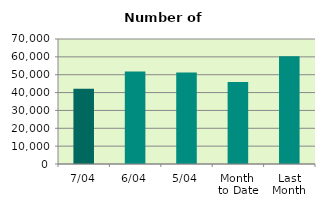
| Category | Series 0 |
|---|---|
| 7/04 | 42180 |
| 6/04 | 51752 |
| 5/04 | 51226 |
| Month 
to Date | 45876.4 |
| Last
Month | 60380.087 |